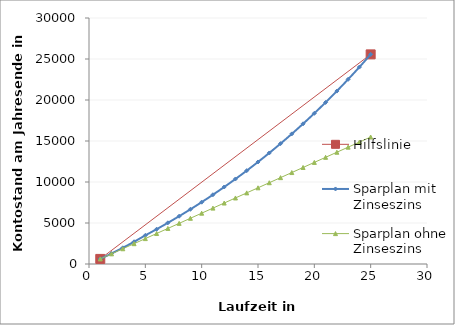
| Category | Hilfslinie |
|---|---|
| 1.0 | 619.5 |
| 25.0 | 25562.124 |